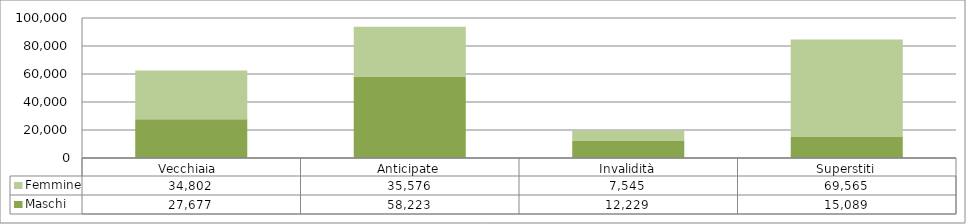
| Category | Maschi | Femmine |
|---|---|---|
| Vecchiaia  | 27677 | 34802 |
| Anticipate | 58223 | 35576 |
| Invalidità | 12229 | 7545 |
| Superstiti | 15089 | 69565 |